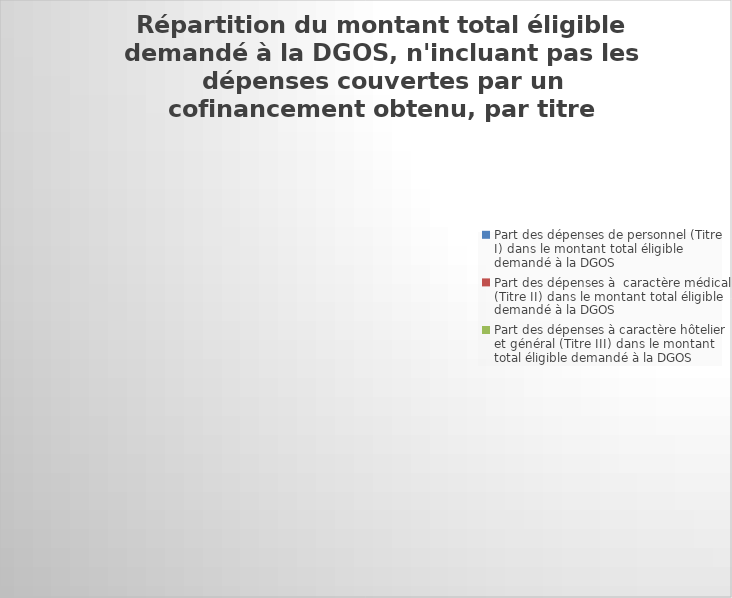
| Category | Series 1 |
|---|---|
| Part des dépenses de personnel (Titre I) dans le montant total éligible demandé à la DGOS | 0 |
| Part des dépenses à  caractère médical (Titre II) dans le montant total éligible demandé à la DGOS | 0 |
| Part des dépenses à caractère hôtelier et général (Titre III) dans le montant total éligible demandé à la DGOS | 0 |